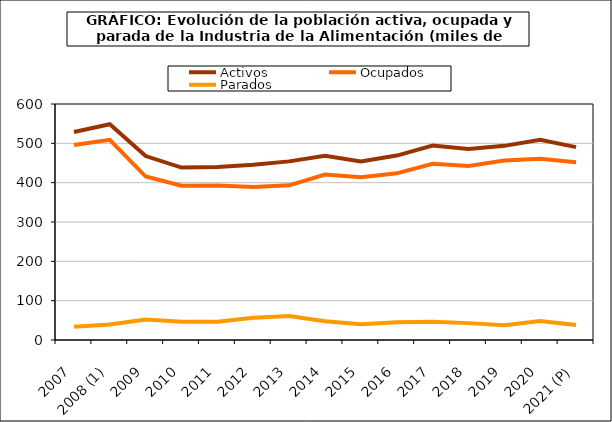
| Category | Activos | Ocupados | Parados |
|---|---|---|---|
| 2007 | 529 | 495.6 | 33.4 |
| 2008 (1) | 548.65 | 509 | 39.7 |
| 2009 | 467.6 | 415.6 | 52 |
| 2010 | 438.425 | 392.275 | 46.2 |
| 2011 | 439.6 | 393.1 | 46.5 |
| 2012 | 445.725 | 388.925 | 56.8 |
| 2013 | 454.1 | 393.3 | 60.8 |
| 2014 | 468.5 | 420.7 | 47.8 |
| 2015 | 454.1 | 414 | 40.1 |
| 2016 | 468.925 | 423.675 | 45.25 |
| 2017 | 494.275 | 448.025 | 46.25 |
| 2018 | 485.3 | 442.4 | 42.9 |
| 2019 | 493.6 | 456.1 | 37.5 |
| 2020 | 508.9 | 460.5 | 48.4 |
| 2021 (P) | 490.375 | 452 | 38.4 |